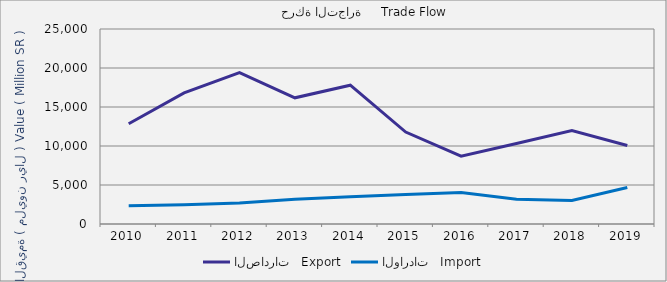
| Category | الصادرات   Export | الواردات   Import |
|---|---|---|
| 2010.0 | 12848719030 | 2341595378 |
| 2011.0 | 16816413996 | 2465969444 |
| 2012.0 | 19404158857 | 2697430216 |
| 2013.0 | 16178241454 | 3187606587 |
| 2014.0 | 17792327390 | 3486963024 |
| 2015.0 | 11788674070 | 3772547712 |
| 2016.0 | 8690750821 | 4041584138 |
| 2017.0 | 10317939373 | 3176491906 |
| 2018.0 | 11976694599 | 3018632735 |
| 2019.0 | 10065752173 | 4683135879 |